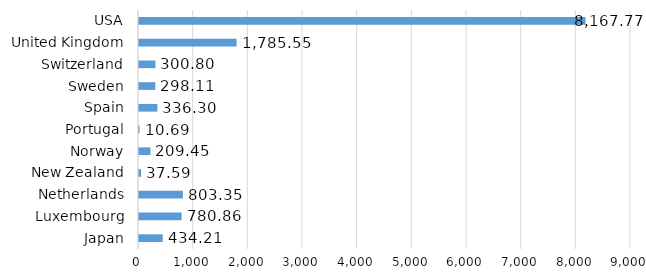
| Category | Series 0 |
|---|---|
| Japan | 434.213 |
| Luxembourg | 780.86 |
| Netherlands | 803.352 |
| New Zealand | 37.594 |
| Norway | 209.451 |
| Portugal | 10.692 |
| Spain | 336.303 |
| Sweden | 298.106 |
| Switzerland | 300.8 |
| United Kingdom | 1785.552 |
| USA | 8167.771 |